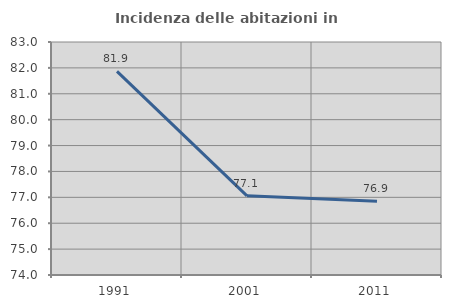
| Category | Incidenza delle abitazioni in proprietà  |
|---|---|
| 1991.0 | 81.868 |
| 2001.0 | 77.057 |
| 2011.0 | 76.852 |